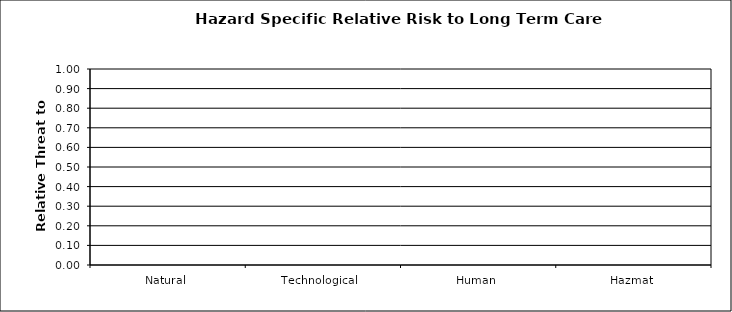
| Category | Series 0 |
|---|---|
| Natural | 0 |
| Technological | 0 |
| Human | 0 |
| Hazmat | 0 |